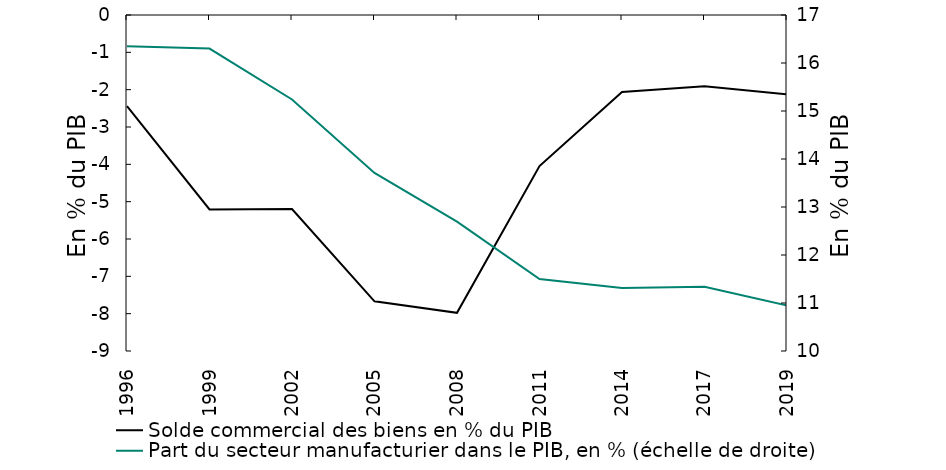
| Category | Solde commercial des biens en % du PIB |
|---|---|
| 1996.0 | -2.439 |
| 1999.0 | -5.209 |
| 2002.0 | -5.199 |
| 2005.0 | -7.669 |
| 2008.0 | -7.977 |
| 2011.0 | -4.046 |
| 2014.0 | -2.061 |
| 2017.0 | -1.906 |
| 2019.0 | -2.127 |